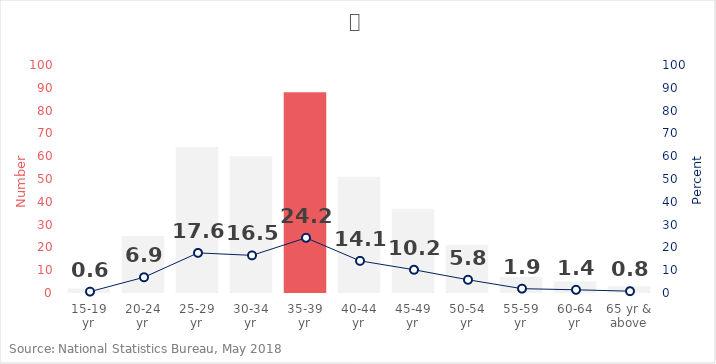
| Category | Female |
|---|---|
| 15-19 yr | 2 |
| 20-24 yr | 25 |
| 25-29 yr | 64 |
| 30-34 yr | 60 |
| 35-39 yr | 88 |
| 40-44 yr | 51 |
| 45-49 yr | 37 |
| 50-54 yr | 21 |
| 55-59 yr | 7 |
| 60-64 yr | 5 |
| 65 yr & above | 3 |